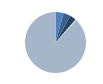
| Category | Series 0 |
|---|---|
| 0 | 38 |
| 1 | 34 |
| 2 | 29 |
| 3 | 5 |
| 4 | 776 |